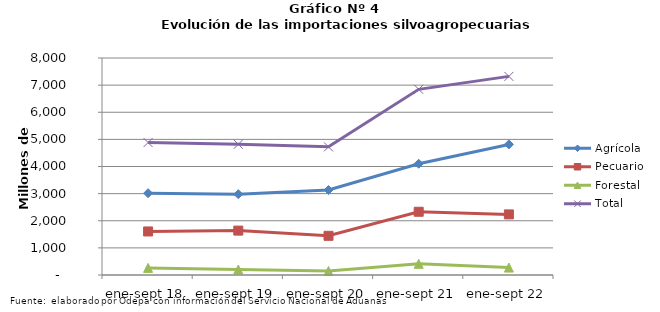
| Category | Agrícola | Pecuario | Forestal | Total |
|---|---|---|---|---|
| ene-sept 18 | 3015043 | 1605343 | 262118 | 4882504 |
| ene-sept 19 | 2980662 | 1636554 | 202106 | 4819322 |
| ene-sept 20 | 3133230 | 1444267 | 146471 | 4723968 |
| ene-sept 21 | 4101446 | 2331495 | 412111 | 6845052 |
| ene-sept 22 | 4814272 | 2234156 | 273763 | 7322191 |